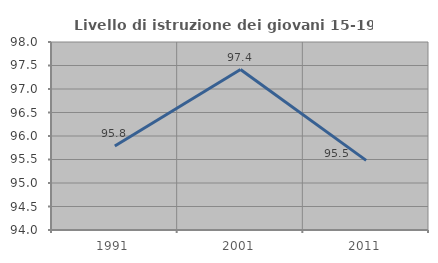
| Category | Livello di istruzione dei giovani 15-19 anni |
|---|---|
| 1991.0 | 95.786 |
| 2001.0 | 97.414 |
| 2011.0 | 95.482 |